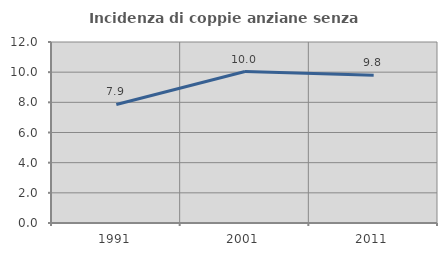
| Category | Incidenza di coppie anziane senza figli  |
|---|---|
| 1991.0 | 7.857 |
| 2001.0 | 10.04 |
| 2011.0 | 9.795 |